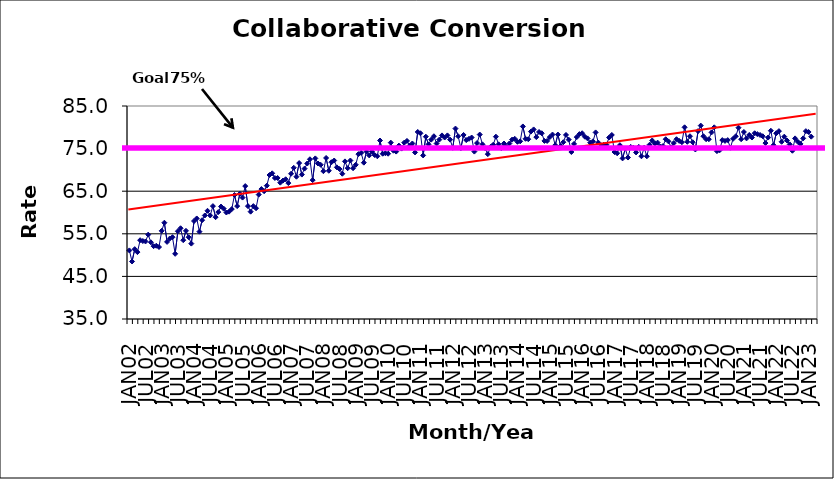
| Category | Series 0 |
|---|---|
| JAN02 | 51.1 |
| FEB02 | 48.5 |
| MAR02 | 51.4 |
| APR02 | 50.7 |
| MAY02 | 53.5 |
| JUN02 | 53.3 |
| JUL02 | 53.2 |
| AUG02 | 54.8 |
| SEP02 | 53 |
| OCT02 | 52.1 |
| NOV02 | 52.2 |
| DEC02 | 51.9 |
| JAN03 | 55.7 |
| FEB03 | 57.6 |
| MAR03 | 53.1 |
| APR03 | 53.9 |
| MAY03 | 54.2 |
| JUN03 | 50.3 |
| JUL03 | 55.6 |
| AUG03 | 56.3 |
| SEP03 | 53.5 |
| OCT03 | 55.7 |
| NOV03 | 54.2 |
| DEC03 | 52.7 |
| JAN04 | 58 |
| FEB04 | 58.6 |
| MAR04 | 55.5 |
| APR04 | 58.2 |
| MAY04 | 59.3 |
| JUN04 | 60.4 |
| JUL04 | 59.3 |
| AUG04 | 61.5 |
| SEP04 | 58.9 |
| OCT04 | 60.1 |
| NOV04 | 61.4 |
| DEC04 | 60.9 |
| JAN05 | 60 |
| FEB05 | 60.2 |
| MAR05 | 60.8 |
| APR05 | 64.1 |
| MAY05 | 61.5 |
| JUN05 | 64.4 |
| JUL05 | 63.5 |
| AUG05 | 66.2 |
| SEP05 | 61.5 |
| OCT05 | 60.2 |
| NOV05 | 61.5 |
| DEC05 | 61 |
| JAN06 | 64.2 |
| FEB06 | 65.5 |
| MAR06 | 65 |
| APR06 | 66.3 |
| MAY06 | 68.8 |
| JUN06 | 69.2 |
| JUL06 | 68.1 |
| AUG06 | 68.1 |
| SEP06 | 67 |
| OCT06 | 67.5 |
| NOV06 | 67.8 |
| DEC06 | 66.9 |
| JAN07 | 69.1 |
| FEB07 | 70.5 |
| MAR07 | 68.4 |
| APR07 | 71.6 |
| MAY07 | 68.9 |
| JUN07 | 70.3 |
| JUL07 | 71.5 |
| AUG07 | 72.5 |
| SEP07 | 67.6 |
| OCT07 | 72.7 |
| NOV07 | 71.5 |
| DEC07 | 71.2 |
| JAN08 | 69.7 |
| FEB08 | 72.8 |
| MAR08 | 69.8 |
| APR08 | 71.8 |
| MAY08 | 72.2 |
| JUN08 | 70.6 |
| JUL08 | 70.2 |
| AUG08 | 69.1 |
| SEP08 | 72 |
| OCT08 | 70.4 |
| NOV08 | 72.2 |
| DEC08 | 70.4 |
| JAN09 | 71.2 |
| FEB09 | 73.7 |
| MAR09 | 74 |
| APR09 | 71.7 |
| MAY09 | 74.3 |
| JUN09 | 73.4 |
| JUL09 | 74.3 |
| AUG09 | 73.5 |
| SEP09 | 73.2 |
| OCT09 | 76.9 |
| NOV09 | 73.8 |
| DEC09 | 73.9 |
| JAN10 | 73.8 |
| FEB10 | 76.4 |
| MAR10 | 74.5 |
| APR10 | 74.3 |
| MAY10 | 75.7 |
| JUN10 | 75 |
| JUL10 | 76.4 |
| AUG10 | 76.8 |
| SEP10 | 75.7 |
| OCT10 | 76.2 |
| NOV10 | 74.1 |
| DEC10 | 78.9 |
| JAN11 | 78.6 |
| FEB11 | 73.4 |
| MAR11 | 77.8 |
| APR11 | 76 |
| MAY11 | 77.1 |
| JUN11 | 77.9 |
| JUL11 | 76.2 |
| AUG11 | 77.1 |
| SEP11 | 78.1 |
| OCT11 | 77.6 |
| NOV11 | 78.1 |
| DEC11 | 77.1 |
| JAN12 | 75.2 |
| FEB12 | 79.7 |
| MAR12 | 77.9 |
| APR12 | 75.1 |
| MAY12 | 78.2 |
| JUN12 | 77 |
| JUL12 | 77.3 |
| AUG12 | 77.6 |
| SEP12 | 74.3 |
| OCT12 | 76.3 |
| NOV12 | 78.3 |
| DEC12 | 76 |
| JAN13 | 75.1 |
| FEB13 | 73.7 |
| MAR13 | 75.4 |
| APR13 | 75.9 |
| MAY13 | 77.8 |
| JUN13 | 76 |
| JUL13 | 75.1 |
| AUG13 | 76.2 |
| SEP13 | 75.4 |
| OCT13 | 76.2 |
| NOV13 | 77.1 |
| DEC13 | 77.3 |
| JAN14 | 76.6 |
| FEB14 | 76.7 |
| MAR14 | 80.2 |
| APR14 | 77.3 |
| MAY14 | 77.2 |
| JUN14 | 79 |
| JUL14 | 79.5 |
| AUG14 | 77.7 |
| SEP14 | 78.9 |
| OCT14 | 78.6 |
| NOV14 | 76.8 |
| DEC14 | 76.8 |
| JAN15 | 77.7 |
| FEB15 | 78.3 |
| MAR15 | 75.8 |
| APR15 | 78.3 |
| MAY15 | 75.6 |
| JUN15 | 76.5 |
| JUL15 | 78.2 |
| AUG15 | 77.1 |
| SEP15 | 74.2 |
| OCT15 | 76.1 |
| NOV15 | 77.7 |
| DEC15 | 78.4 |
| JAN16 | 78.6 |
| FEB16 | 77.8 |
| MAR16 | 77.4 |
| APR16 | 76.4 |
| MAY16 | 76.7 |
| JUN16 | 78.8 |
| JUL16 | 76.4 |
| AUG16 | 75.5 |
| SEP16 | 75.9 |
| OCT16 | 75.9 |
| NOV16 | 77.6 |
| DEC16 | 78.2 |
| JAN17 | 74.2 |
| FEB17 | 73.9 |
| MAR17 | 75.8 |
| APR17 | 72.7 |
| MAY17 | 75 |
| JUN17 | 72.9 |
| JUL17 | 75.4 |
| AUG17 | 75.2 |
| SEP17 | 74.1 |
| OCT17 | 75.4 |
| NOV17 | 73.2 |
| DEC17 | 75.2 |
| JAN18 | 73.2 |
| FEB18 | 75.9 |
| MAR18 | 76.9 |
| APR18 | 76.2 |
| MAY18 | 76.4 |
| JUN18 | 75.5 |
| JUL18 | 75.6 |
| AUG18 | 77.2 |
| SEP18 | 76.7 |
| OCT18 | 75.3 |
| NOV18 | 76.3 |
| DEC18 | 77.2 |
| JAN19 | 76.8 |
| FEB19 | 76.5 |
| MAR19 | 80 |
| APR19 | 76.6 |
| MAY19 | 77.9 |
| JUN19 | 76.5 |
| JUL19 | 74.8 |
| AUG19 | 79.1 |
| SEP19 | 80.4 |
| OCT19 | 77.9 |
| NOV19 | 77.2 |
| DEC19 | 77.2 |
| JAN20 | 78.8 |
| FEB20 | 80 |
| MAR20 | 74.4 |
| APR20 | 74.6 |
| MAY20 | 77 |
| JUN20 | 76.8 |
| JUL20 | 77 |
| AUG20 | 75.2 |
| SEP20 | 77.3 |
| OCT20 | 77.9 |
| NOV20 | 79.9 |
| DEC20 | 77.2 |
| JAN21 | 78.9 |
| FEB21 | 77.4 |
| MAR21 | 78.2 |
| APR21 | 77.6 |
| MAY21 | 78.6 |
| JUN21 | 78.4 |
| JUL21 | 78.2 |
| AUG21 | 77.9 |
| SEP21 | 76.3 |
| OCT21 | 77.6 |
| NOV21 | 79.2 |
| DEC21 | 75.8 |
| JAN22 | 78.6 |
| FEB22 | 79.1 |
| MAR22 | 76.6 |
| APR22 | 77.8 |
| MAY22 | 76.9 |
| JUN22 | 76 |
| JUL22 | 74.5 |
| AUG22 | 77.4 |
| SEP22 | 76.6 |
| OCT22 | 76.1 |
| NOV22 | 77.4 |
| DEC22 | 79.1 |
| JAN23 | 78.9 |
| FEB23 | 77.8 |